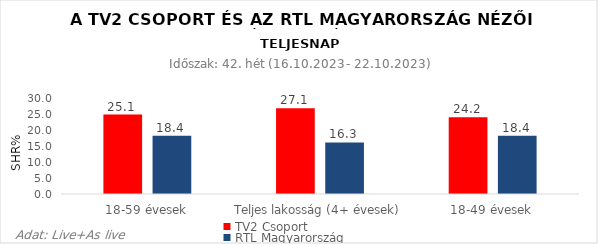
| Category | TV2 Csoport | RTL Magyarország |
|---|---|---|
| 18-59 évesek | 25.1 | 18.4 |
| Teljes lakosság (4+ évesek) | 27.1 | 16.3 |
| 18-49 évesek | 24.2 | 18.4 |